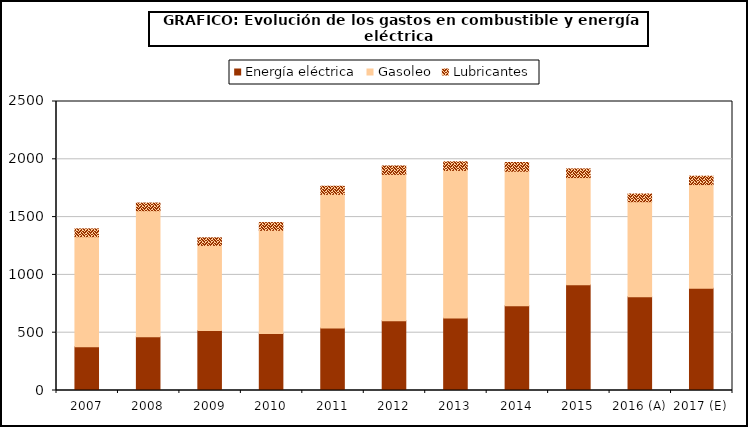
| Category | Energía eléctrica | Gasoleo | Lubricantes |
|---|---|---|---|
| 2007 | 379.292 | 951.283 | 67.537 |
| 2008 | 465.509 | 1089.777 | 66.177 |
| 2009 | 519.861 | 735.254 | 65.464 |
| 2010 | 492.737 | 892.822 | 66.957 |
| 2011 | 541.39 | 1155.464 | 70.222 |
| 2012 | 602.887 | 1266.655 | 72.753 |
| 2013 | 628.022 | 1275.795 | 74.642 |
| 2014 | 733.314 | 1163.411 | 75.37 |
| 2015 | 915.498 | 926.353 | 75.218 |
| 2016 (A) | 811.842 | 821.469 | 66.701 |
| 2017 (E) | 885.342 | 895.84 | 72.74 |